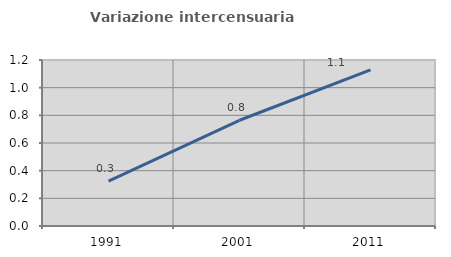
| Category | Variazione intercensuaria annua |
|---|---|
| 1991.0 | 0.324 |
| 2001.0 | 0.764 |
| 2011.0 | 1.129 |